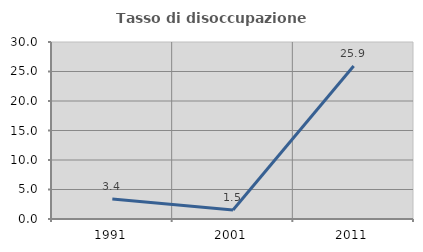
| Category | Tasso di disoccupazione giovanile  |
|---|---|
| 1991.0 | 3.371 |
| 2001.0 | 1.538 |
| 2011.0 | 25.926 |